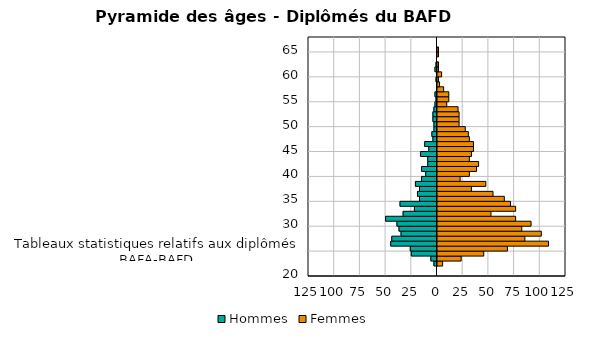
| Category | Hommes | Femmes |
|---|---|---|
| 20 | 0 | 0 |
| 21 | 0 | 0 |
| 22 | -3 | 5 |
| 23 | -6 | 23 |
| 24 | -25 | 45 |
| Tableaux statistiques relatifs aux diplômés BAFA-BAFD | -26 | 68 |
| 26 | -45 | 108 |
| 27 | -44 | 85 |
| 28 | -35 | 101 |
| 29 | -37 | 82 |
| 30 | -39 | 91 |
| 31 | -50 | 76 |
| 32 | -33 | 52 |
| 33 | -22 | 76 |
| 34 | -36 | 71 |
| 35 | -17 | 65 |
| 36 | -19 | 54 |
| 37 | -17 | 33 |
| 38 | -21 | 47 |
| 39 | -15 | 22 |
| 40 | -11 | 31 |
| 41 | -15 | 38 |
| 42 | -9 | 40 |
| 43 | -9 | 31 |
| 44 | -16 | 33 |
| 45 | -8 | 35 |
| 46 | -12 | 35 |
| 47 | -4 | 31 |
| 48 | -5 | 30 |
| 49 | -3 | 27 |
| 50 | -3 | 21 |
| 51 | -4 | 21 |
| 52 | -4 | 21 |
| 53 | -3 | 20 |
| 54 | -2 | 9 |
| 55 | -1 | 11 |
| 56 | -2 | 11 |
| 57 | 0 | 6 |
| 58 | 0 | 2 |
| 59 | -1 | 1 |
| 60 | 0 | 4 |
| 61 | -2 | 1 |
| 62 | -1 | 1 |
| 63 | 0 | 0 |
| 64 | 0 | 1 |
| 65 | 0 | 1 |
| 67 | 0 | 0 |
| 69 | 0 | 0 |